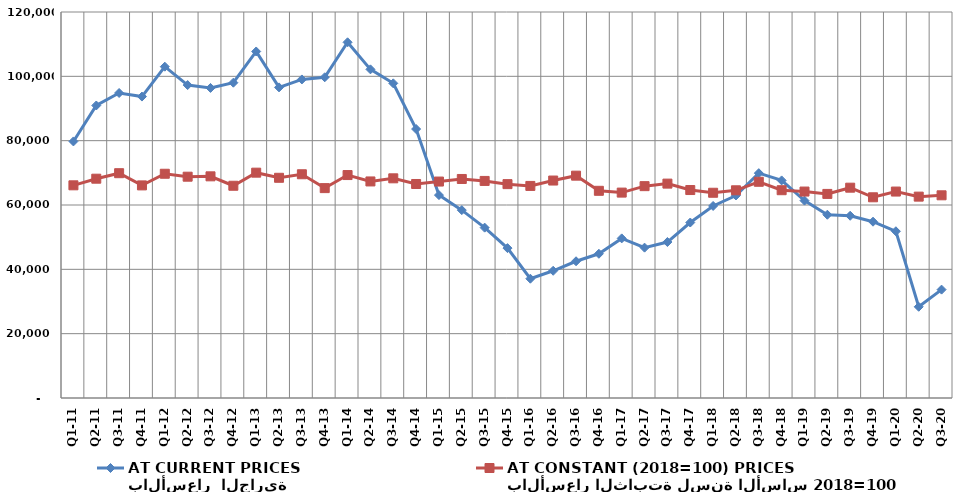
| Category | بالأسعار  الجارية
AT CURRENT PRICES | بالأسعار الثابتة لسنة الأساس 2018=100
AT CONSTANT (2018=100) PRICES |
|---|---|---|
| Q1-11 | 79762.26 | 66115.635 |
| Q2-11 | 90934.534 | 68178.594 |
| Q3-11 | 94819.673 | 69888.529 |
| Q4-11 | 93710.543 | 66091.928 |
| Q1-12 | 103001.756 | 69713.748 |
| Q2-12 | 97282.582 | 68797.152 |
| Q3-12 | 96392.279 | 68911.805 |
| Q4-12 | 98020.285 | 65981.471 |
| Q1-13 | 107727.107 | 70051.709 |
| Q2-13 | 96563.811 | 68461.367 |
| Q3-13 | 99032.565 | 69555.177 |
| Q4-13 | 99707.049 | 65247.393 |
| Q1-14 | 110580.467 | 69308.867 |
| Q2-14 | 102169.527 | 67321.129 |
| Q3-14 | 97822.003 | 68292.762 |
| Q4-14 | 83617.712 | 66529.489 |
| Q1-15 | 63078.037 | 67287.655 |
| Q2-15 | 58407.079 | 68087.858 |
| Q3-15 | 52959.132 | 67481.844 |
| Q4-15 | 46597.085 | 66485.266 |
| Q1-16 | 37086.987 | 65926.21 |
| Q2-16 | 39550.427 | 67602.59 |
| Q3-16 | 42506.578 | 69119.923 |
| Q4-16 | 44839.556 | 64412.462 |
| Q1-17 | 49622.542 | 63855.238 |
| Q2-17 | 46742.453 | 65861.865 |
| Q3-17 | 48489.288 | 66647.955 |
| Q4-17 | 54550.908 | 64648.766 |
| Q1-18 | 59700.368 | 63803.741 |
| Q2-18 | 62954.883 | 64573.499 |
| Q3-18 | 69897.859 | 67222.372 |
| Q4-18 | 67644.564 | 64598.063 |
| Q1-19 | 61367.668 | 64178.48 |
| Q2-19 | 56973.562 | 63448.517 |
| Q3-19 | 56653.698 | 65382.493 |
| Q4-19 | 54807.721 | 62399.014 |
| Q1-20 | 51838.655 | 64178.215 |
| Q2-20 | 28361.846 | 62600.438 |
| Q3-20 | 33696.539 | 63011.92 |